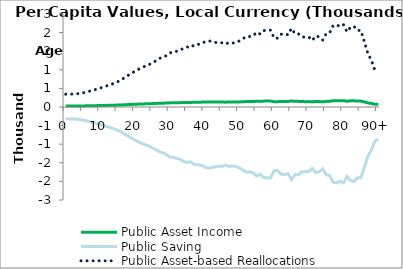
| Category | Public Asset Income | Public Saving | Public Asset-based Reallocations |
|---|---|---|---|
| 0 | 26.524 | -318.482 | 345.006 |
|  | 26.618 | -319.617 | 346.235 |
| 2 | 26.713 | -320.751 | 347.464 |
| 3 | 27.115 | -325.587 | 352.702 |
| 4 | 28.113 | -337.568 | 365.682 |
| 5 | 29.285 | -351.636 | 380.921 |
| 6 | 30.879 | -370.773 | 401.651 |
| 7 | 33.042 | -396.754 | 429.796 |
| 8 | 34.955 | -419.719 | 454.674 |
| 9 | 37.083 | -445.268 | 482.351 |
| 10 | 39.312 | -472.038 | 511.35 |
| 11 | 41.658 | -500.207 | 541.865 |
| 12 | 44.114 | -529.7 | 573.815 |
| 13 | 46.622 | -559.814 | 606.437 |
| 14 | 49.036 | -588.794 | 637.829 |
| 15 | 52.365 | -628.772 | 681.137 |
| 16 | 56.311 | -676.154 | 732.465 |
| 17 | 60.864 | -730.822 | 791.686 |
| 18 | 65.384 | -785.097 | 850.481 |
| 19 | 70.083 | -841.518 | 911.601 |
| 20 | 74.214 | -891.124 | 965.338 |
| 21 | 78.1 | -937.78 | 1015.879 |
| 22 | 81.956 | -984.088 | 1066.044 |
| 23 | 84.73 | -1017.394 | 1102.124 |
| 24 | 87.564 | -1051.418 | 1138.982 |
| 25 | 91.963 | -1104.241 | 1196.203 |
| 26 | 95.56 | -1147.437 | 1242.997 |
| 27 | 100.458 | -1206.245 | 1306.703 |
| 28 | 102.435 | -1229.981 | 1332.416 |
| 29 | 106.474 | -1278.486 | 1384.96 |
| 30 | 112.125 | -1346.34 | 1458.465 |
| 31 | 112.648 | -1352.615 | 1465.263 |
| 32 | 115.333 | -1384.852 | 1500.185 |
| 33 | 117.2 | -1407.281 | 1524.481 |
| 34 | 122.206 | -1467.388 | 1589.595 |
| 35 | 123.873 | -1487.405 | 1611.278 |
| 36 | 122.819 | -1474.744 | 1597.563 |
| 37 | 128.715 | -1545.539 | 1674.254 |
| 38 | 129.365 | -1553.349 | 1682.715 |
| 39 | 130.445 | -1566.31 | 1696.755 |
| 40 | 134.499 | -1614.993 | 1749.493 |
| 41 | 136.47 | -1638.66 | 1775.13 |
| 42 | 135.938 | -1632.266 | 1768.204 |
| 43 | 133.714 | -1605.571 | 1739.286 |
| 44 | 132.6 | -1592.191 | 1724.791 |
| 45 | 132.676 | -1593.102 | 1725.778 |
| 46 | 130.039 | -1561.438 | 1691.477 |
| 47 | 133.023 | -1597.271 | 1730.295 |
| 48 | 131.966 | -1584.572 | 1716.538 |
| 49 | 133.324 | -1600.884 | 1734.208 |
| 50 | 136.6 | -1640.223 | 1776.823 |
| 51 | 140.861 | -1691.379 | 1832.24 |
| 52 | 145.964 | -1752.663 | 1898.627 |
| 53 | 145.695 | -1749.431 | 1895.127 |
| 54 | 147.351 | -1769.306 | 1916.656 |
| 55 | 154.473 | -1854.834 | 2009.308 |
| 56 | 150.818 | -1810.944 | 1961.763 |
| 57 | 157.891 | -1895.867 | 2053.757 |
| 58 | 158.594 | -1904.313 | 2062.907 |
| 59 | 158.849 | -1907.379 | 2066.229 |
| 60 | 142.359 | -1709.372 | 1851.731 |
| 61 | 142.166 | -1707.058 | 1849.225 |
| 62 | 150.347 | -1805.281 | 1955.627 |
| 63 | 151.204 | -1815.572 | 1966.776 |
| 64 | 149.183 | -1791.31 | 1940.493 |
| 65 | 162.406 | -1950.089 | 2112.495 |
| 66 | 151.778 | -1822.472 | 1974.251 |
| 67 | 151.352 | -1817.353 | 1968.705 |
| 68 | 144.975 | -1740.778 | 1885.752 |
| 69 | 144.215 | -1731.655 | 1875.87 |
| 70 | 144.586 | -1736.116 | 1880.703 |
| 71 | 137.478 | -1650.764 | 1788.242 |
| 72 | 146.974 | -1764.783 | 1911.757 |
| 73 | 144.927 | -1740.202 | 1885.128 |
| 74 | 138.409 | -1661.936 | 1800.345 |
| 75 | 151.662 | -1821.082 | 1972.744 |
| 76 | 153.42 | -1842.183 | 1995.602 |
| 77 | 168.211 | -2019.787 | 2187.998 |
| 78 | 169.72 | -2037.906 | 2207.625 |
| 79 | 166.092 | -1994.341 | 2160.433 |
| 80 | 169.873 | -2039.738 | 2209.611 |
| 81 | 155.449 | -1866.544 | 2021.993 |
| 82 | 164.722 | -1977.888 | 2142.61 |
| 83 | 166.821 | -2003.093 | 2169.914 |
| 84 | 158.428 | -1902.324 | 2060.752 |
| 85 | 158.103 | -1898.421 | 2056.524 |
| 86 | 134.993 | -1620.923 | 1755.915 |
| 87 | 110.655 | -1328.685 | 1439.34 |
| 88 | 96.828 | -1162.662 | 1259.49 |
| 89 | 76.639 | -920.238 | 996.877 |
| 90+ | 71.521 | -858.787 | 930.308 |